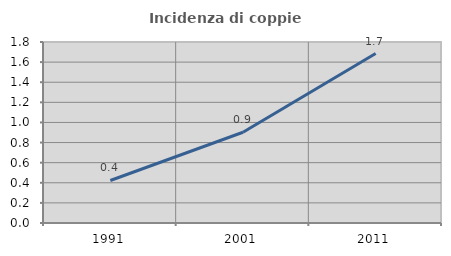
| Category | Incidenza di coppie miste |
|---|---|
| 1991.0 | 0.423 |
| 2001.0 | 0.902 |
| 2011.0 | 1.685 |